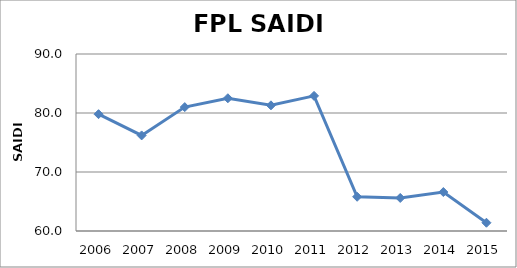
| Category | FPL |
|---|---|
| 2006.0 | 79.8 |
| 2007.0 | 76.2 |
| 2008.0 | 81 |
| 2009.0 | 82.5 |
| 2010.0 | 81.3 |
| 2011.0 | 82.9 |
| 2012.0 | 65.8 |
| 2013.0 | 65.6 |
| 2014.0 | 66.6 |
| 2015.0 | 61.4 |